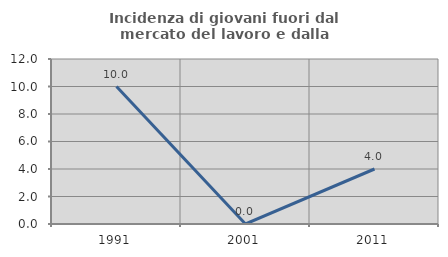
| Category | Incidenza di giovani fuori dal mercato del lavoro e dalla formazione  |
|---|---|
| 1991.0 | 10 |
| 2001.0 | 0 |
| 2011.0 | 4 |